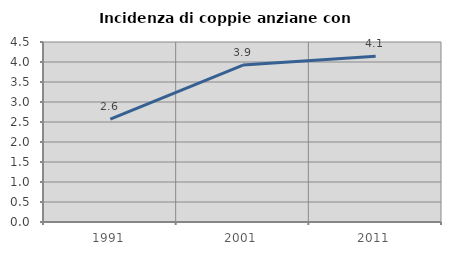
| Category | Incidenza di coppie anziane con figli |
|---|---|
| 1991.0 | 2.571 |
| 2001.0 | 3.924 |
| 2011.0 | 4.143 |